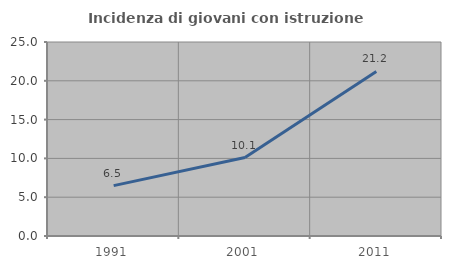
| Category | Incidenza di giovani con istruzione universitaria |
|---|---|
| 1991.0 | 6.494 |
| 2001.0 | 10.116 |
| 2011.0 | 21.2 |